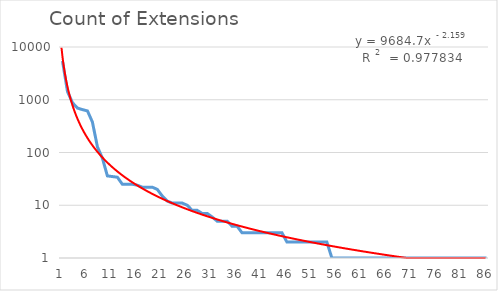
| Category | Count of Extensions |
|---|---|
| 0 | 5421 |
| 1 | 1430 |
| 2 | 878 |
| 3 | 695 |
| 4 | 650 |
| 5 | 615 |
| 6 | 378 |
| 7 | 128 |
| 8 | 78 |
| 9 | 36 |
| 10 | 35 |
| 11 | 34 |
| 12 | 25 |
| 13 | 25 |
| 14 | 25 |
| 15 | 24 |
| 16 | 22 |
| 17 | 22 |
| 18 | 22 |
| 19 | 20 |
| 20 | 15 |
| 21 | 12 |
| 22 | 11 |
| 23 | 11 |
| 24 | 11 |
| 25 | 10 |
| 26 | 8 |
| 27 | 8 |
| 28 | 7 |
| 29 | 7 |
| 30 | 6 |
| 31 | 5 |
| 32 | 5 |
| 33 | 5 |
| 34 | 4 |
| 35 | 4 |
| 36 | 3 |
| 37 | 3 |
| 38 | 3 |
| 39 | 3 |
| 40 | 3 |
| 41 | 3 |
| 42 | 3 |
| 43 | 3 |
| 44 | 3 |
| 45 | 2 |
| 46 | 2 |
| 47 | 2 |
| 48 | 2 |
| 49 | 2 |
| 50 | 2 |
| 51 | 2 |
| 52 | 2 |
| 53 | 2 |
| 54 | 1 |
| 55 | 1 |
| 56 | 1 |
| 57 | 1 |
| 58 | 1 |
| 59 | 1 |
| 60 | 1 |
| 61 | 1 |
| 62 | 1 |
| 63 | 1 |
| 64 | 1 |
| 65 | 1 |
| 66 | 1 |
| 67 | 1 |
| 68 | 1 |
| 69 | 1 |
| 70 | 1 |
| 71 | 1 |
| 72 | 1 |
| 73 | 1 |
| 74 | 1 |
| 75 | 1 |
| 76 | 1 |
| 77 | 1 |
| 78 | 1 |
| 79 | 1 |
| 80 | 1 |
| 81 | 1 |
| 82 | 1 |
| 83 | 1 |
| 84 | 1 |
| 85 | 1 |